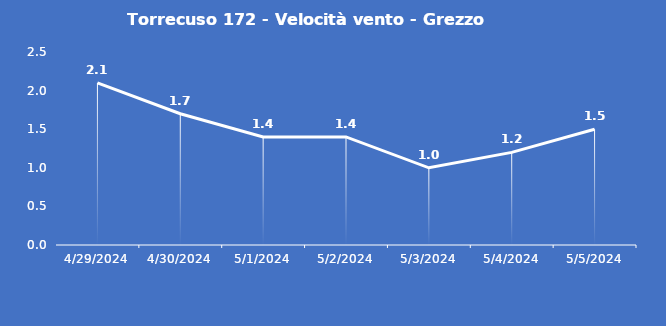
| Category | Torrecuso 172 - Velocità vento - Grezzo (m/s) |
|---|---|
| 4/29/24 | 2.1 |
| 4/30/24 | 1.7 |
| 5/1/24 | 1.4 |
| 5/2/24 | 1.4 |
| 5/3/24 | 1 |
| 5/4/24 | 1.2 |
| 5/5/24 | 1.5 |